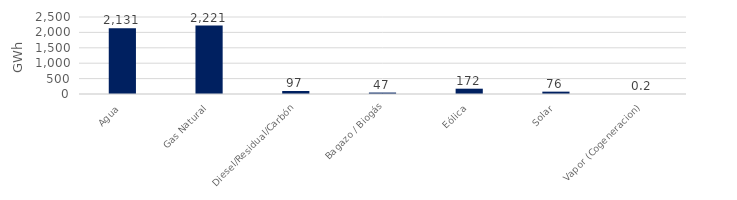
| Category | Series 0 |
|---|---|
| Agua | 2130.978 |
| Gas Natural | 2221.482 |
| Diesel/Residual/Carbón | 96.729 |
| Bagazo / Biogás | 46.955 |
| Eólica | 172.173 |
| Solar | 76.338 |
| Vapor (Cogeneracion) | 0.219 |